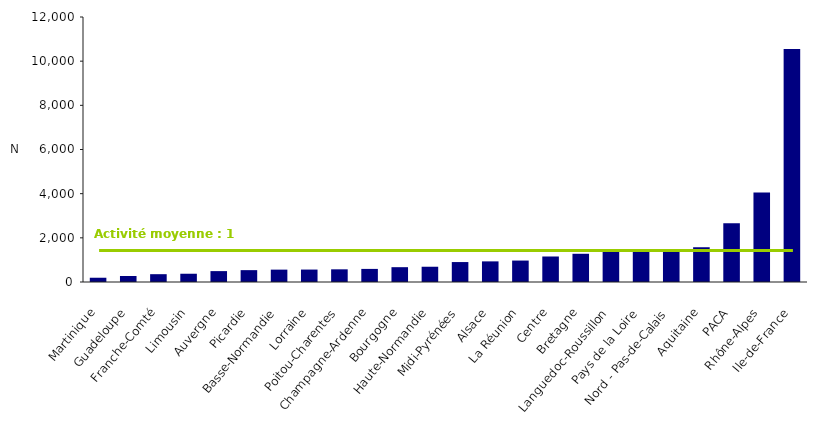
| Category | Nombre de femmes
couples vus par un CPDPN |
|---|---|
| Martinique | 193 |
| Guadeloupe | 272 |
| Franche-Comté | 354 |
| Limousin | 374 |
| Auvergne | 493 |
| Picardie | 537 |
| Basse-Normandie | 560 |
| Lorraine | 563 |
| Poitou-Charentes | 574 |
| Champagne-Ardenne | 593 |
| Bourgogne | 671 |
| Haute-Normandie | 691 |
| Midi-Pyrénées | 903 |
| Alsace | 934 |
| La Réunion | 971 |
| Centre | 1155 |
| Bretagne | 1278 |
| Languedoc-Roussillon | 1421 |
| Pays de la Loire | 1425 |
| Nord - Pas-de-Calais | 1473 |
| Aquitaine | 1574 |
| PACA | 2661 |
| Rhône-Alpes | 4049 |
| Ile-de-France | 10547 |